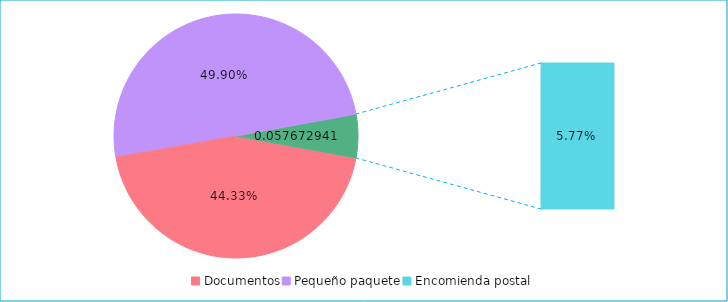
| Category | Series 0 |
|---|---|
| Documentos | 0.443 |
| Pequeño paquete | 0.499 |
| Encomienda postal | 0.058 |